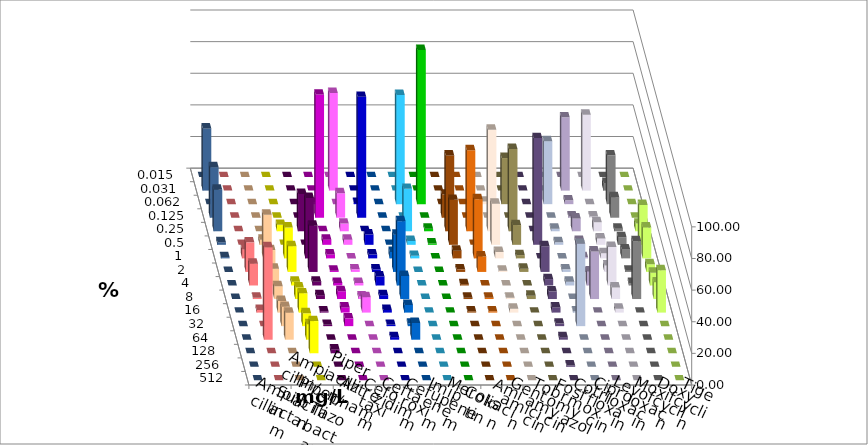
| Category | Ampicillin | Ampicillin/ Sulbactam | Piperacillin | Piperacillin/ Tazobactam | Aztreonam | Cefotaxim | Ceftazidim | Cefuroxim | Imipenem | Meropenem | Colistin | Amikacin | Gentamicin | Tobramycin | Fosfomycin | Cotrimoxazol | Ciprofloxacin | Levofloxacin | Moxifloxacin | Doxycyclin | Tigecyclin |
|---|---|---|---|---|---|---|---|---|---|---|---|---|---|---|---|---|---|---|---|---|---|
| 0.015 | 0 | 0 | 0 | 0 | 0 | 0 | 0 | 0 | 0 | 0 | 0 | 0 | 0 | 0 | 0 | 0 | 0 | 0 | 0 | 0 | 0 |
| 0.031 | 0 | 0 | 0 | 0 | 0 | 61.789 | 0 | 0 | 0 | 0 | 0 | 0 | 0 | 0 | 0 | 0 | 46.341 | 47.967 | 4.878 | 0 | 39.344 |
| 0.062 | 0 | 0 | 0 | 0 | 0.82 | 0 | 0.813 | 0 | 69.106 | 97.561 | 0 | 0 | 1.626 | 29.167 | 0 | 39.837 | 2.439 | 0 | 30.894 | 0 | 0 |
| 0.125 | 0 | 0 | 0 | 0 | 77.869 | 15.447 | 76.423 | 0 | 0 | 0 | 14.634 | 0 | 0 | 0 | 0 | 0 | 0.813 | 0.813 | 13.008 | 0 | 31.967 |
| 0.25 | 0 | 0 | 4.065 | 23.577 | 0 | 4.878 | 0 | 0 | 26.829 | 1.626 | 47.967 | 51.22 | 64.228 | 52.083 | 0 | 1.626 | 8.13 | 5.691 | 1.626 | 4.878 | 26.23 |
| 0.5 | 0 | 3.252 | 0 | 0 | 3.279 | 3.252 | 6.504 | 0 | 2.439 | 0.813 | 28.455 | 0 | 26.016 | 12.5 | 67.48 | 1.626 | 2.439 | 4.065 | 4.878 | 25.203 | 1.639 |
| 1.0 | 5.691 | 27.642 | 19.512 | 38.211 | 2.459 | 0 | 2.439 | 4.065 | 1.626 | 0 | 4.878 | 37.398 | 4.065 | 2.083 | 0 | 0 | 0.813 | 3.252 | 5.691 | 19.512 | 0.82 |
| 2.0 | 18.699 | 13.821 | 16.26 | 29.268 | 0.82 | 1.626 | 1.626 | 23.577 | 0 | 0 | 1.626 | 9.756 | 0.813 | 2.083 | 16.26 | 1.626 | 0 | 4.065 | 0.813 | 4.878 | 0 |
| 4.0 | 13.821 | 10.569 | 2.439 | 2.439 | 1.639 | 1.626 | 5.691 | 40.65 | 0 | 0 | 0.813 | 0 | 0 | 0 | 4.065 | 2.439 | 8.943 | 24.39 | 1.626 | 8.13 | 0 |
| 8.0 | 0.813 | 8.13 | 7.317 | 2.439 | 4.918 | 1.626 | 2.439 | 14.634 | 0 | 0 | 0.813 | 0.813 | 0.813 | 2.083 | 4.878 | 0 | 30.081 | 7.317 | 36.585 | 10.569 | 0 |
| 16.0 | 1.626 | 7.317 | 12.195 | 0.813 | 3.279 | 9.756 | 1.626 | 4.878 | 0 | 0 | 0.813 | 0.813 | 2.439 | 0 | 3.252 | 0.813 | 0 | 2.439 | 0 | 26.829 | 0 |
| 32.0 | 0 | 12.195 | 8.13 | 0.813 | 4.918 | 0 | 0.813 | 1.626 | 0 | 0 | 0 | 0 | 0 | 0 | 1.626 | 52.033 | 0 | 0 | 0 | 0 | 0 |
| 64.0 | 58.537 | 17.073 | 9.756 | 0 | 0 | 0 | 1.626 | 10.569 | 0 | 0 | 0 | 0 | 0 | 0 | 1.626 | 0 | 0 | 0 | 0 | 0 | 0 |
| 128.0 | 0 | 0 | 20.325 | 2.439 | 0 | 0 | 0 | 0 | 0 | 0 | 0 | 0 | 0 | 0 | 0 | 0 | 0 | 0 | 0 | 0 | 0 |
| 256.0 | 0 | 0 | 0 | 0 | 0 | 0 | 0 | 0 | 0 | 0 | 0 | 0 | 0 | 0 | 0.813 | 0 | 0 | 0 | 0 | 0 | 0 |
| 512.0 | 0 | 0 | 0 | 0 | 0 | 0 | 0 | 0 | 0 | 0 | 0 | 0 | 0 | 0 | 0 | 0 | 0 | 0 | 0 | 0 | 0 |